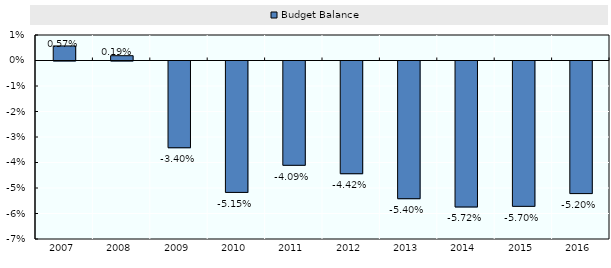
| Category | Budget Balance |
|---|---|
| 2007.0 | 0.006 |
| 2008.0 | 0.002 |
| 2009.0 | -0.034 |
| 2010.0 | -0.052 |
| 2011.0 | -0.041 |
| 2012.0 | -0.044 |
| 2013.0 | -0.054 |
| 2014.0 | -0.057 |
| 2015.0 | -0.057 |
| 2016.0 | -0.052 |